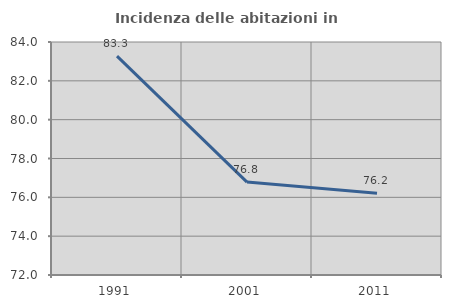
| Category | Incidenza delle abitazioni in proprietà  |
|---|---|
| 1991.0 | 83.27 |
| 2001.0 | 76.786 |
| 2011.0 | 76.205 |